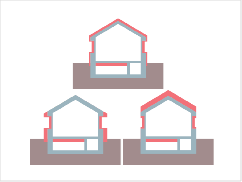
| Category | Series 0 | Series 1 | Series 2 | Series 3 | Series 4 | Series 5 |
|---|---|---|---|---|---|---|
| 0 | 0 | 0 | 0 | 0 | 0 | 1 |